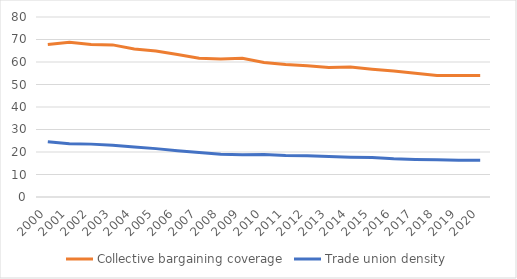
| Category | Collective bargaining coverage | Trade union density |
|---|---|---|
| 2000.0 | 67.8 | 24.6 |
| 2001.0 | 68.8 | 23.7 |
| 2002.0 | 67.8 | 23.5 |
| 2003.0 | 67.6 | 23 |
| 2004.0 | 65.8 | 22.2 |
| 2005.0 | 64.9 | 21.5 |
| 2006.0 | 63.3 | 20.6 |
| 2007.0 | 61.7 | 19.8 |
| 2008.0 | 61.3 | 19 |
| 2009.0 | 61.7 | 18.8 |
| 2010.0 | 59.8 | 18.9 |
| 2011.0 | 58.9 | 18.4 |
| 2012.0 | 58.3 | 18.3 |
| 2013.0 | 57.6 | 18 |
| 2014.0 | 57.8 | 17.7 |
| 2015.0 | 56.8 | 17.6 |
| 2016.0 | 56 | 17 |
| 2017.0 | 55 | 16.7 |
| 2018.0 | 54 | 16.6 |
| 2019.0 | 54 | 16.3 |
| 2020.0 | 54 | 16.3 |